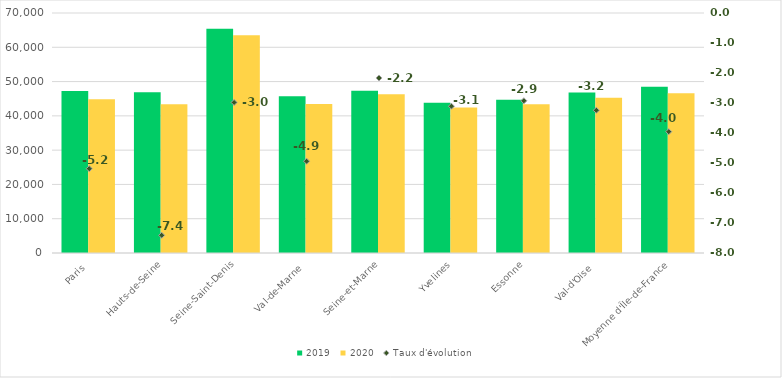
| Category | 2019 | 2020 |
|---|---|---|
| Paris | 47266 | 44813 |
| Hauts-de-Seine | 46849 | 43378 |
| Seine-Saint-Denis | 65433 | 63482 |
| Val-de-Marne | 45743 | 43483 |
| Seine-et-Marne | 47312 | 46287 |
| Yvelines | 43828 | 42466 |
| Essonne | 44708 | 43400 |
| Val-d'Oise | 46814 | 45296 |
| Moyenne d'Île-de-France | 48494.125 | 46575.625 |